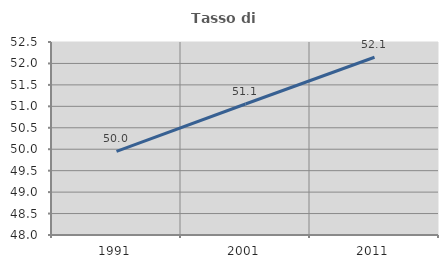
| Category | Tasso di occupazione   |
|---|---|
| 1991.0 | 49.952 |
| 2001.0 | 51.055 |
| 2011.0 | 52.144 |